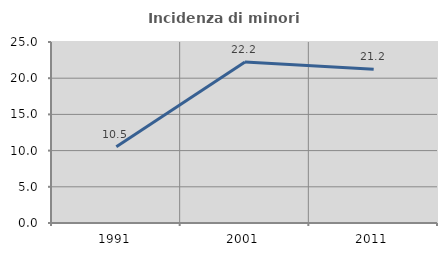
| Category | Incidenza di minori stranieri |
|---|---|
| 1991.0 | 10.526 |
| 2001.0 | 22.222 |
| 2011.0 | 21.229 |